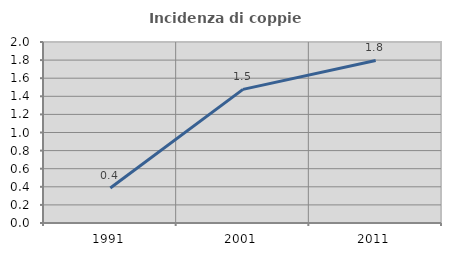
| Category | Incidenza di coppie miste |
|---|---|
| 1991.0 | 0.387 |
| 2001.0 | 1.477 |
| 2011.0 | 1.796 |